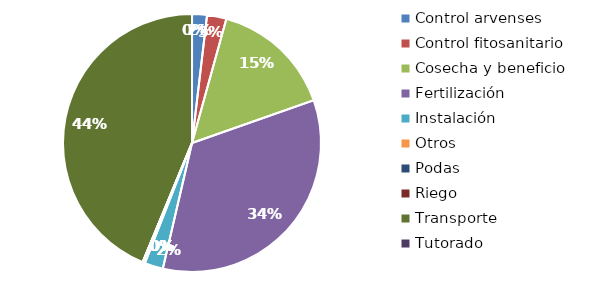
| Category | Valor |
|---|---|
| Control arvenses | 950000 |
| Control fitosanitario | 1236000 |
| Cosecha y beneficio | 7800000 |
| Fertilización | 17303000 |
| Instalación | 1179000 |
| Otros | 150000 |
| Podas | 0 |
| Riego | 0 |
| Transporte | 22265000 |
| Tutorado | 0 |